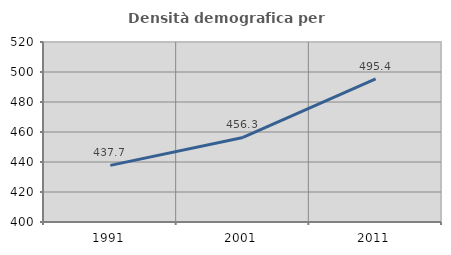
| Category | Densità demografica |
|---|---|
| 1991.0 | 437.735 |
| 2001.0 | 456.337 |
| 2011.0 | 495.36 |